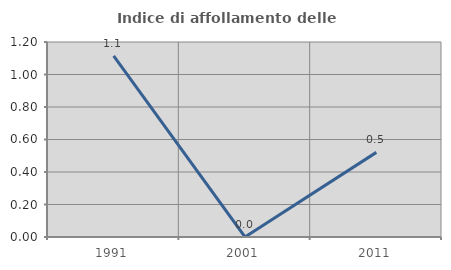
| Category | Indice di affollamento delle abitazioni  |
|---|---|
| 1991.0 | 1.114 |
| 2001.0 | 0 |
| 2011.0 | 0.521 |